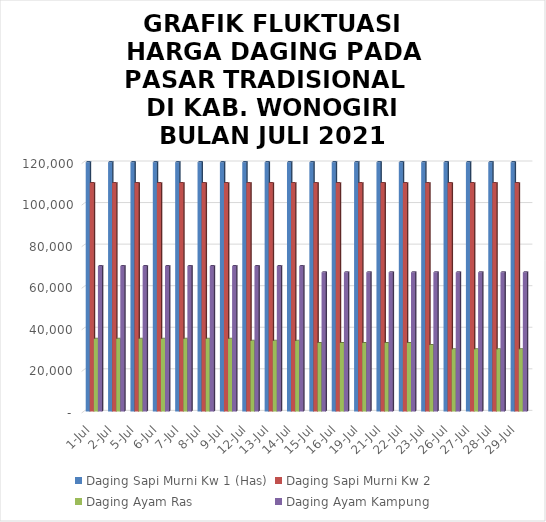
| Category | Daging Sapi Murni Kw 1 (Has) | Daging Sapi Murni Kw 2 | Daging Ayam Ras | Daging Ayam Kampung |
|---|---|---|---|---|
| 2021-07-01 | 120000 | 110000 | 35000 | 70000 |
| 2021-07-02 | 120000 | 110000 | 35000 | 70000 |
| 2021-07-05 | 120000 | 110000 | 35000 | 70000 |
| 2021-07-06 | 120000 | 110000 | 35000 | 70000 |
| 2021-07-07 | 120000 | 110000 | 35000 | 70000 |
| 2021-07-08 | 120000 | 110000 | 35000 | 70000 |
| 2021-07-09 | 120000 | 110000 | 35000 | 70000 |
| 2021-07-12 | 120000 | 110000 | 34000 | 70000 |
| 2021-07-13 | 120000 | 110000 | 34000 | 70000 |
| 2021-07-14 | 120000 | 110000 | 34000 | 70000 |
| 2021-07-15 | 120000 | 110000 | 33000 | 67000 |
| 2021-07-16 | 120000 | 110000 | 33000 | 67000 |
| 2021-07-19 | 120000 | 110000 | 33000 | 67000 |
| 2021-07-21 | 120000 | 110000 | 33000 | 67000 |
| 2021-07-22 | 120000 | 110000 | 33000 | 67000 |
| 2021-07-23 | 120000 | 110000 | 32000 | 67000 |
| 2021-07-26 | 120000 | 110000 | 30000 | 67000 |
| 2021-07-27 | 120000 | 110000 | 30000 | 67000 |
| 2021-07-28 | 120000 | 110000 | 30000 | 67000 |
| 2021-07-29 | 120000 | 110000 | 30000 | 67000 |